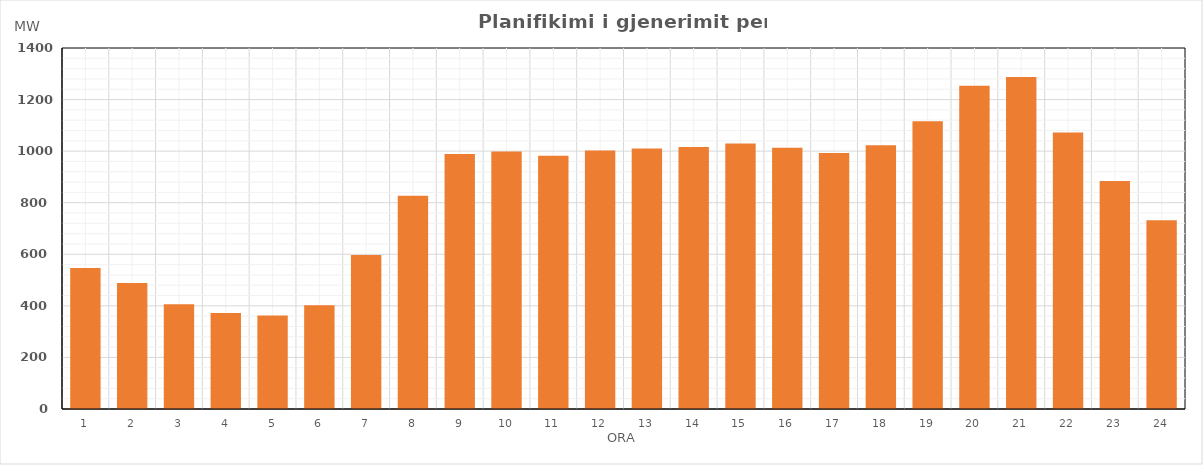
| Category | Max (MW) |
|---|---|
| 0 | 547.126 |
| 1 | 488.738 |
| 2 | 406.4 |
| 3 | 372.74 |
| 4 | 362.676 |
| 5 | 402.017 |
| 6 | 597.461 |
| 7 | 826.965 |
| 8 | 989.255 |
| 9 | 998.329 |
| 10 | 982.185 |
| 11 | 1002.321 |
| 12 | 1010.268 |
| 13 | 1016.403 |
| 14 | 1029.499 |
| 15 | 1013.413 |
| 16 | 993.203 |
| 17 | 1023.217 |
| 18 | 1116.187 |
| 19 | 1253.257 |
| 20 | 1287.55 |
| 21 | 1072.563 |
| 22 | 884.365 |
| 23 | 732.204 |